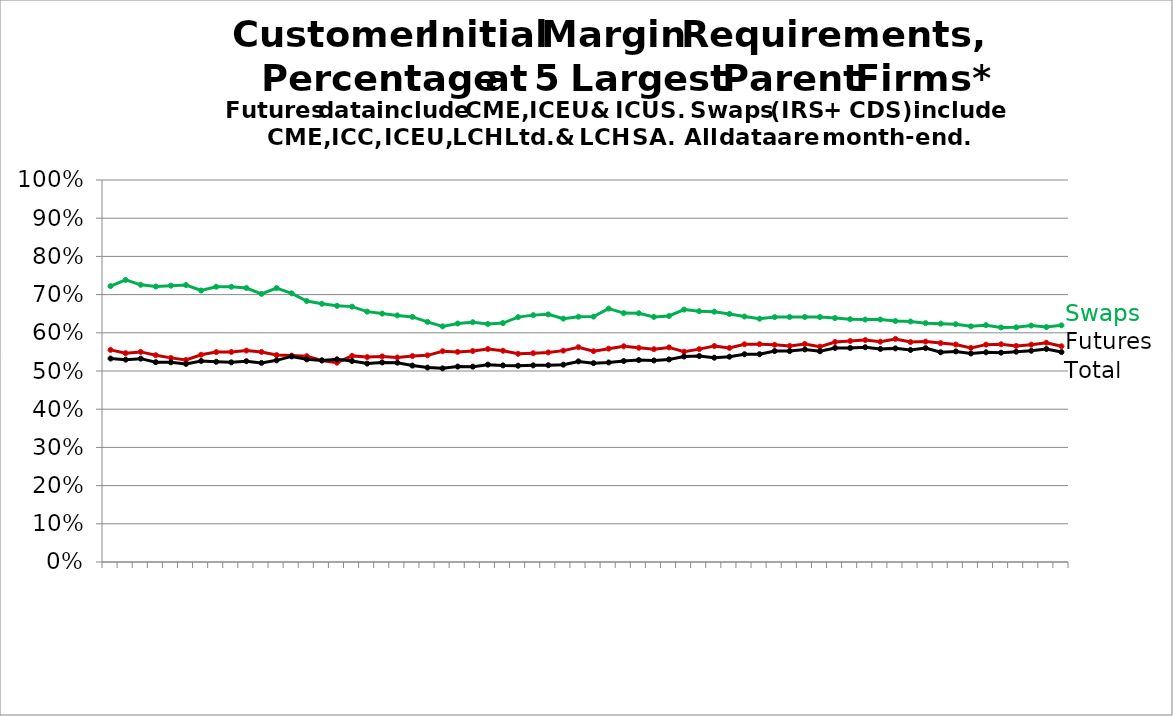
| Category | Futures | Swaps | Total | Series 8 | Series 9 |
|---|---|---|---|---|---|
| nan |  |  |  |  |  |
| 2014-03-31 |  |  |  |  |  |
| nan |  |  |  |  |  |
| 2014-05-30 |  |  |  |  |  |
| nan |  |  |  |  |  |
| 2014-07-31 |  |  |  |  |  |
| nan |  |  |  |  |  |
| 2014-09-30 |  |  |  |  |  |
| nan |  |  |  |  |  |
| 2014-11-28 |  |  |  |  |  |
| nan |  |  |  |  |  |
| 2015-01-30 |  |  |  |  |  |
| nan |  |  |  |  |  |
| 2015-03-31 |  |  |  |  |  |
| nan |  |  |  |  |  |
| 2015-05-29 |  |  |  |  |  |
| nan |  |  |  |  |  |
| 2015-07-31 |  |  |  |  |  |
| nan |  |  |  |  |  |
| 2015-09-30 |  |  |  |  |  |
| nan |  |  |  |  |  |
| 2015-11-30 |  |  |  |  |  |
| nan |  |  |  |  |  |
| 2016-01-29 |  |  |  |  |  |
| nan |  |  |  |  |  |
| 2016-03-31 |  |  |  |  |  |
| nan |  |  |  |  |  |
| 2016-05-31 |  |  |  |  |  |
| nan |  |  |  |  |  |
| 2016-07-29 |  |  |  |  |  |
| nan |  |  |  |  |  |
| 2016-09-30 |  |  |  |  |  |
| nan |  |  |  |  |  |
| 2016-11-30 |  |  |  |  |  |
| nan |  |  |  |  |  |
| 2017-01-31 |  |  |  |  |  |
| nan |  |  |  |  |  |
| 2017-03-31 |  |  |  |  |  |
| nan |  |  |  |  |  |
| 2017-05-31 |  |  |  |  |  |
| nan |  |  |  |  |  |
| 2017-07-31 |  |  |  |  |  |
| nan |  |  |  |  |  |
| 2017-09-29 |  |  |  |  |  |
| nan |  |  |  |  |  |
| 2017-11-30 |  |  |  |  |  |
| nan |  |  |  |  |  |
| 2018-01-31 |  |  |  |  |  |
| nan |  |  |  |  |  |
| 2018-03-29 |  |  |  |  |  |
| nan |  |  |  |  |  |
| 2018-05-31 |  |  |  |  |  |
| nan |  |  |  |  |  |
| 2018-07-31 |  |  |  |  |  |
| nan |  |  |  |  |  |
| 2018-09-28 |  |  |  |  |  |
| nan |  |  |  |  |  |
| 2018-11-30 |  |  |  |  |  |
| nan |  |  |  |  |  |
| 2019-01-31 |  |  |  |  |  |
| nan |  |  |  |  |  |
| 2019-03-29 |  |  |  |  |  |
| nan |  |  |  |  |  |
| 2019-05-31 |  |  |  |  |  |